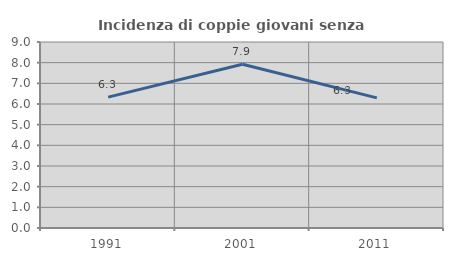
| Category | Incidenza di coppie giovani senza figli |
|---|---|
| 1991.0 | 6.334 |
| 2001.0 | 7.921 |
| 2011.0 | 6.295 |